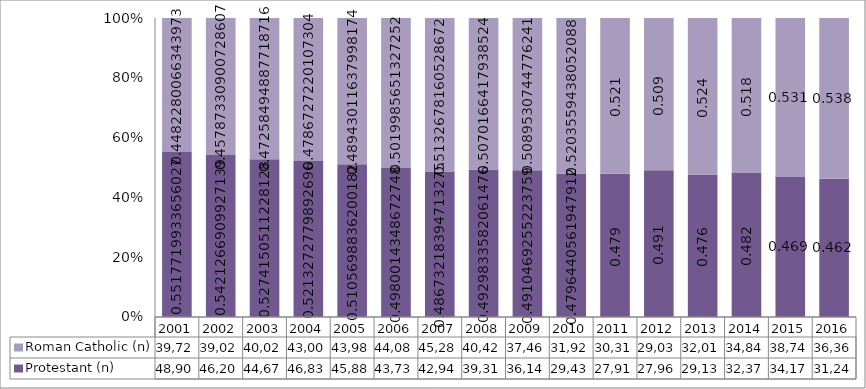
| Category | Protestant (n) | Roman Catholic (n) |
|---|---|---|
| 2001.0 | 48903 | 39726 |
| 2002.0 | 46206 | 39025 |
| 2003.0 | 44671 | 40027 |
| 2004.0 | 46835 | 43003 |
| 2005.0 | 45889 | 43989 |
| 2006.0 | 43731 | 44082 |
| 2007.0 | 42940 | 45281 |
| 2008.0 | 39310 | 40429 |
| 2009.0 | 36144 | 37462 |
| 2010.0 | 29430 | 31928 |
| 2011.0 | 27919 | 30310 |
| 2012.0 | 27961 | 29034 |
| 2013.0 | 29136 | 32012 |
| 2014.0 | 32376 | 34844 |
| 2015.0 | 34174 | 38747 |
| 2016.0 | 31245 | 36362 |